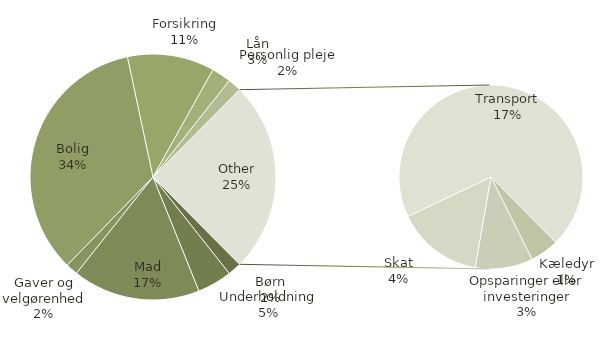
| Category | Zbir |
|---|---|
| Børn | 140 |
| Underholdning | 358 |
| Mad | 1320 |
| Gaver og velgørenhed | 125 |
| Bolig | 2702 |
| Forsikring | 900 |
| Lån | 200 |
| Personlig pleje | 140 |
| Kæledyr | 100 |
| Opsparinger eller investeringer | 200 |
| Skat | 300 |
| Transport | 1375 |